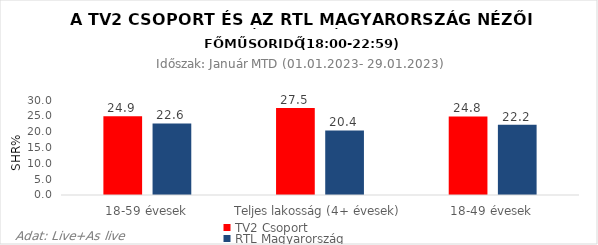
| Category | TV2 Csoport | RTL Magyarország |
|---|---|---|
| 18-59 évesek | 24.9 | 22.6 |
| Teljes lakosság (4+ évesek) | 27.5 | 20.4 |
| 18-49 évesek | 24.8 | 22.2 |